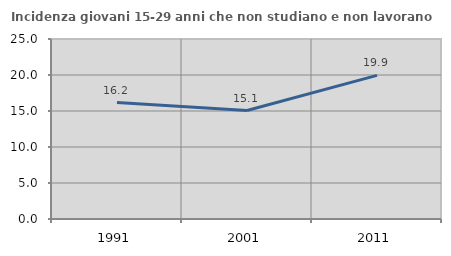
| Category | Incidenza giovani 15-29 anni che non studiano e non lavorano  |
|---|---|
| 1991.0 | 16.164 |
| 2001.0 | 15.061 |
| 2011.0 | 19.942 |